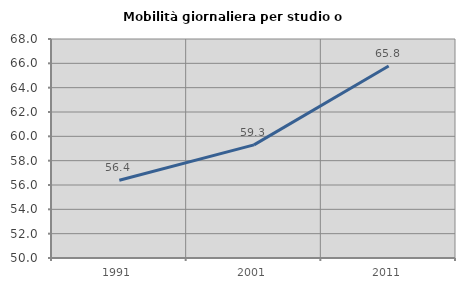
| Category | Mobilità giornaliera per studio o lavoro |
|---|---|
| 1991.0 | 56.393 |
| 2001.0 | 59.301 |
| 2011.0 | 65.777 |